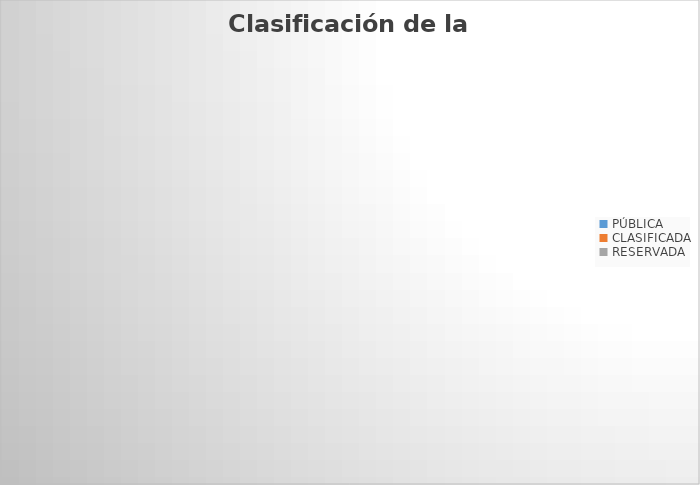
| Category | Clasificación de la Información |
|---|---|
| PÚBLICA | 0 |
| CLASIFICADA | 0 |
| RESERVADA | 0 |